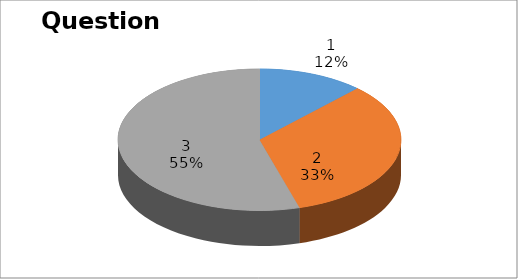
| Category | Series 0 |
|---|---|
| 0 | 4 |
| 1 | 11 |
| 2 | 18 |